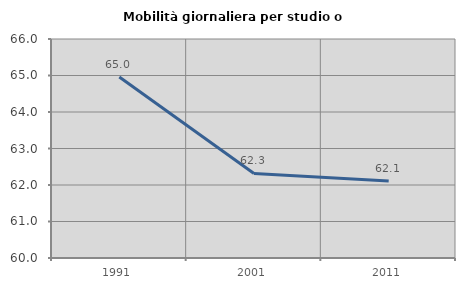
| Category | Mobilità giornaliera per studio o lavoro |
|---|---|
| 1991.0 | 64.961 |
| 2001.0 | 62.316 |
| 2011.0 | 62.109 |